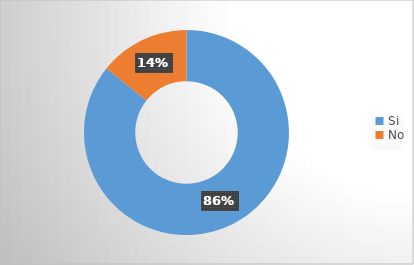
| Category | Series 0 |
|---|---|
| Si | 0.857 |
| No | 0.143 |